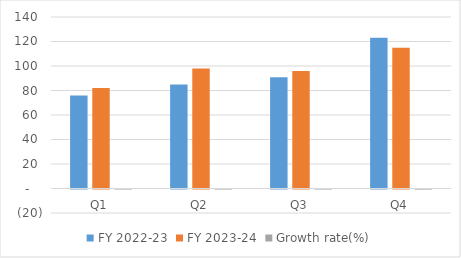
| Category | FY 2022-23 | FY 2023-24 | Growth rate(%) |
|---|---|---|---|
| Q1 | 76 | 82 | 0.079 |
| Q2 | 85 | 98 | 0.153 |
| Q3 | 90.8 | 96 | 0.057 |
| Q4 | 123 | 115 | -0.065 |